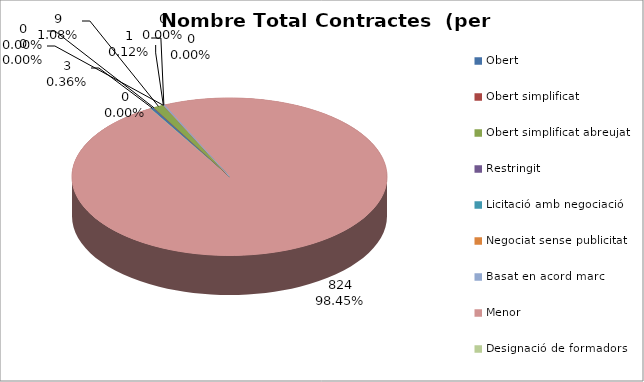
| Category | Nombre Total Contractes |
|---|---|
| Obert | 3 |
| Obert simplificat | 0 |
| Obert simplificat abreujat | 9 |
| Restringit | 0 |
| Licitació amb negociació | 0 |
| Negociat sense publicitat | 0 |
| Basat en acord marc | 1 |
| Menor | 824 |
| Designació de formadors | 0 |